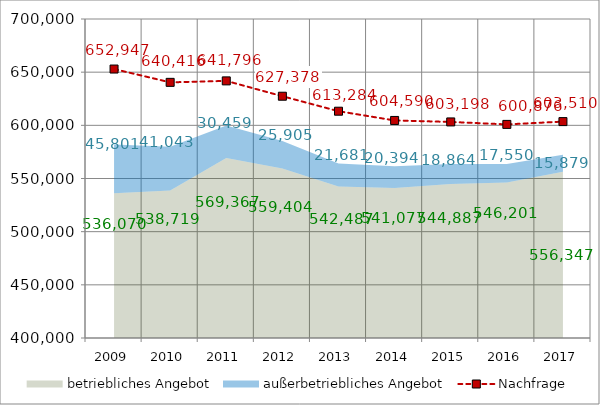
| Category | Nachfrage |
|---|---|
| 2009.0 | 652947 |
| 2010.0 | 640416 |
| 2011.0 | 641796 |
| 2012.0 | 627378 |
| 2013.0 | 613284 |
| 2014.0 | 604590 |
| 2015.0 | 603198 |
| 2016.0 | 600876 |
| 2017.0 | 603510 |